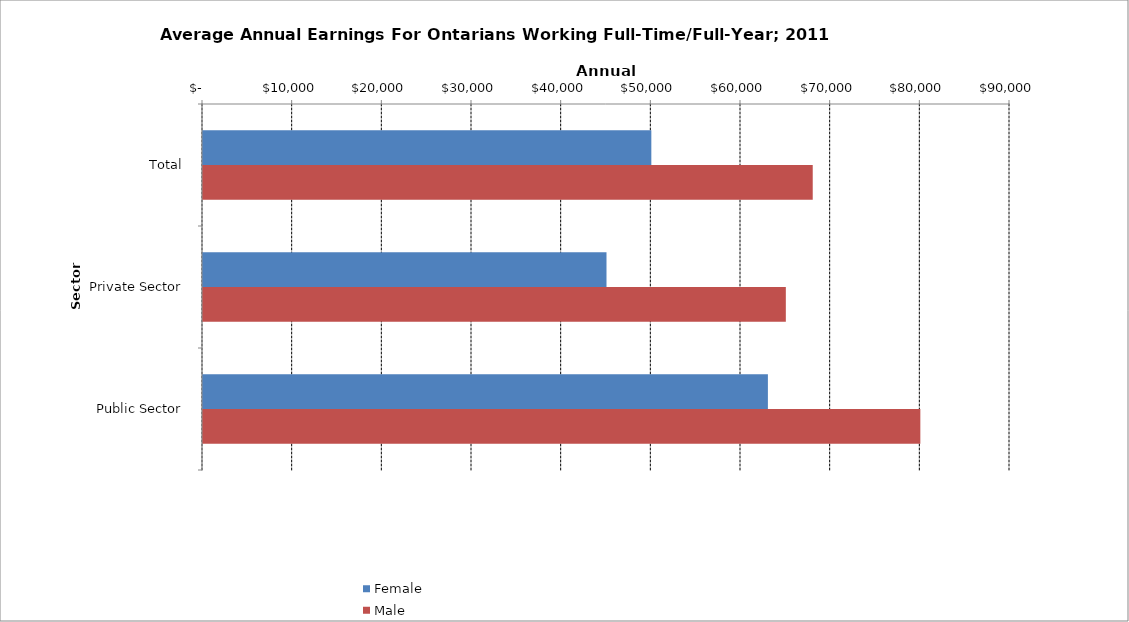
| Category | Female | Male |
|---|---|---|
| Total | 50000 | 68000 |
|  Private Sector  | 45000 | 65000 |
|  Public Sector  | 63000 | 80000 |